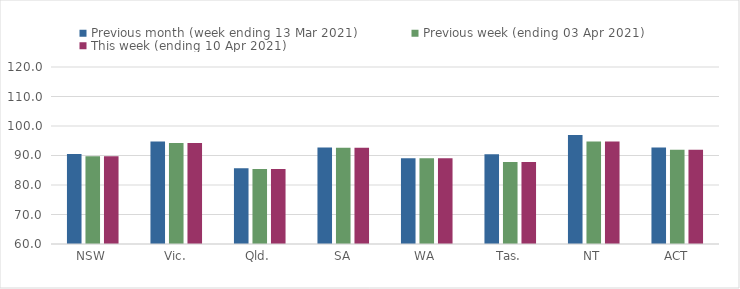
| Category | Previous month (week ending 13 Mar 2021) | Previous week (ending 03 Apr 2021) | This week (ending 10 Apr 2021) |
|---|---|---|---|
| NSW | 90.52 | 89.78 | 89.78 |
| Vic. | 94.77 | 94.2 | 94.2 |
| Qld. | 85.69 | 85.46 | 85.46 |
| SA | 92.72 | 92.64 | 92.64 |
| WA | 89.03 | 89.1 | 89.1 |
| Tas. | 90.42 | 87.82 | 87.82 |
| NT | 96.93 | 94.74 | 94.74 |
| ACT | 92.67 | 91.95 | 91.95 |